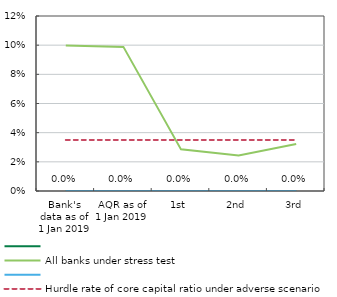
| Category | Series 0 | All banks under stress test | Series 3 | Hurdle rate of core capital ratio under adverse scenario |
|---|---|---|---|---|
| Bank's data as of 1 Jan 2019 | 0 | 0.1 | 0 | 0.035 |
| AQR as of 1 Jan 2019 | 0 | 0.099 | 0 | 0.035 |
| 1st | 0 | 0.029 | 0 | 0.035 |
| 2nd | 0 | 0.024 | 0 | 0.035 |
| 3rd | 0 | 0.032 | 0 | 0.035 |